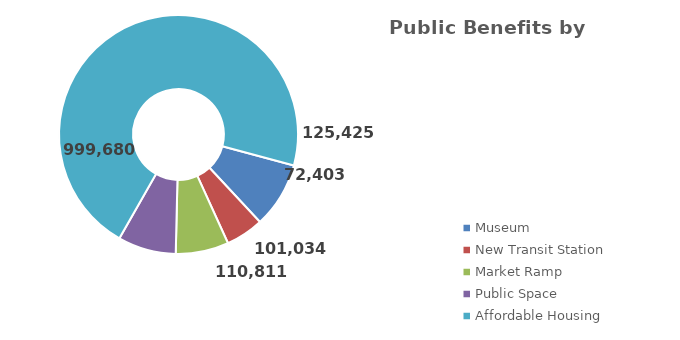
| Category | Series 0 |
|---|---|
| Museum | 125425 |
| New Transit Station | 72403 |
| Market Ramp | 101034 |
| Public Space | 110811 |
| Affordable Housing | 999680 |